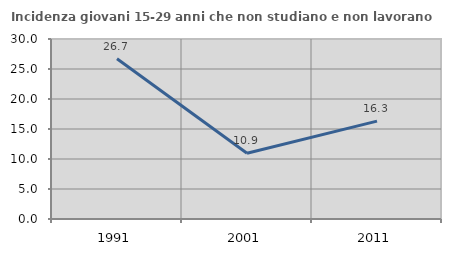
| Category | Incidenza giovani 15-29 anni che non studiano e non lavorano  |
|---|---|
| 1991.0 | 26.708 |
| 2001.0 | 10.949 |
| 2011.0 | 16.319 |